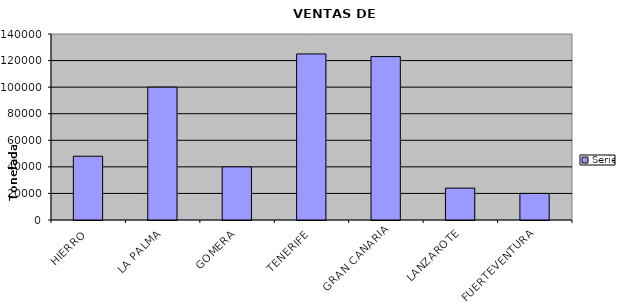
| Category | Series 0 |
|---|---|
| HIERRO | 48000 |
| LA PALMA | 100000 |
| GOMERA | 40000 |
| TENERIFE | 125000 |
| GRAN CANARIA | 123000 |
| LANZAROTE | 24000 |
| FUERTEVENTURA | 20000 |